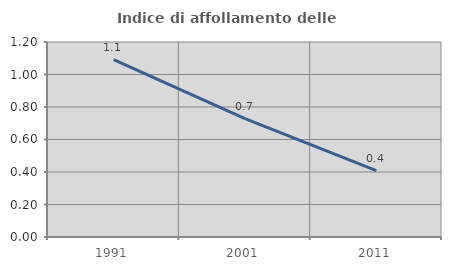
| Category | Indice di affollamento delle abitazioni  |
|---|---|
| 1991.0 | 1.092 |
| 2001.0 | 0.729 |
| 2011.0 | 0.408 |